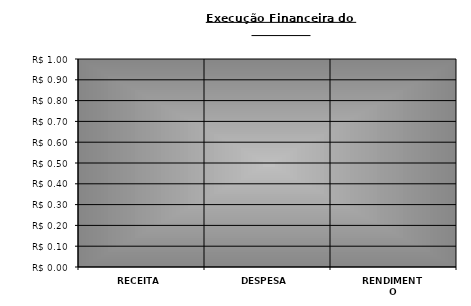
| Category | Series 0 |
|---|---|
| RECEITA | 0 |
| DESPESA | 0 |
| RENDIMENTO | 0 |